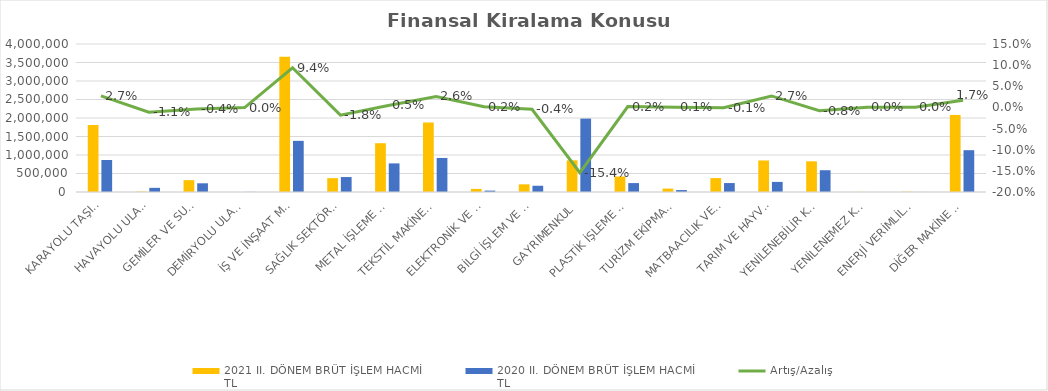
| Category | 2021 II. DÖNEM BRÜT İŞLEM HACMİ 
TL | 2020 II. DÖNEM BRÜT İŞLEM HACMİ 
TL |
|---|---|---|
| KARAYOLU TAŞITLARI | 1811135.997 | 865351.897 |
| HAVAYOLU ULAŞIM ARAÇLARI | 11001 | 112086.655 |
| GEMİLER VE SUDA YÜZEN TAŞIT VE ARAÇLAR | 320305.586 | 235337.506 |
| DEMİRYOLU ULAŞIM ARAÇLARI | 0 | 3781 |
| İŞ VE İNŞAAT MAKİNELERİ | 3653356.123 | 1382400.169 |
| SAĞLIK SEKTÖRÜ VE ESTETİK EKİPMANLARI | 373993.543 | 404246.178 |
| METAL İŞLEME MAKİNELERİ | 1318756.467 | 773258.623 |
| TEKSTİL MAKİNELERİ | 1878793.638 | 920076.923 |
| ELEKTRONİK VE OPTİK CİHAZLAR | 83696.658 | 37320.826 |
| BİLGİ İŞLEM VE BÜRO SİSTEMLERİ | 207586.785 | 168806.793 |
| GAYRİMENKUL | 856050.224 | 1984124.5 |
| PLASTİK İŞLEME MAKİNELERİ | 419024.727 | 240824.586 |
| TURİZM EKİPMANLARI | 92221.875 | 52169.921 |
| MATBAACILIK VE KAĞIT İŞLEME MAKİNELERİ | 375645.664 | 241573.446 |
| TARIM VE HAYVANCILIK MAKİNELERİ | 852567.645 | 272901.636 |
| YENİLENEBİLİR KAYNAKLI ELEKTRİK ENERJİSİ ÜRETİM EKİPMANLARI | 829377.181 | 588757.902 |
| YENİLENEMEZ KAYNAKLI ELEKTRİK ENERJİSİ ÜRETİM EKİPMANLARI | 2857 | 0 |
| ENERJİ VERİMLİLİĞİ EKİPMANLARI | 8548.692 | 1202.74 |
| DİĞER MAKİNE VE EKİPMANLAR | 2082720.629 | 1129823.015 |